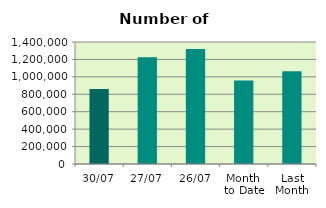
| Category | Series 0 |
|---|---|
| 30/07 | 861580 |
| 27/07 | 1224684 |
| 26/07 | 1318404 |
| Month 
to Date | 959610.095 |
| Last
Month | 1063954.857 |